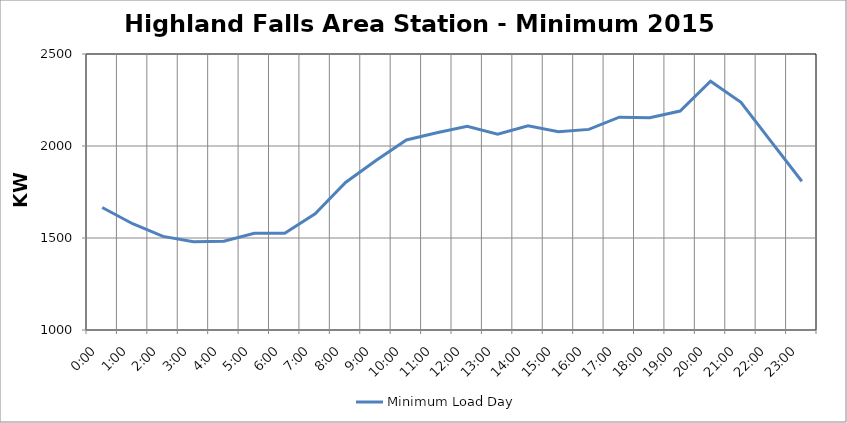
| Category | Minimum Load Day |
|---|---|
| 0.0 | 1665.585 |
| 0.041666666666666664 | 1577.508 |
| 0.08333333333333333 | 1508.923 |
| 0.125 | 1479.854 |
| 0.16666666666666666 | 1481.999 |
| 0.20833333333333334 | 1525.292 |
| 0.25 | 1526.347 |
| 0.2916666666666667 | 1631.322 |
| 0.3333333333333333 | 1801.879 |
| 0.375 | 1921.045 |
| 0.4166666666666667 | 2032.881 |
| 0.4583333333333333 | 2071.716 |
| 0.5 | 2106.872 |
| 0.5416666666666666 | 2064.701 |
| 0.5833333333333334 | 2109.912 |
| 0.625 | 2077.414 |
| 0.6666666666666666 | 2090.299 |
| 0.7083333333333334 | 2156.429 |
| 0.75 | 2153.29 |
| 0.7916666666666666 | 2190.189 |
| 0.8333333333333334 | 2352.041 |
| 0.875 | 2237.053 |
| 0.9166666666666666 | 2022.496 |
| 0.9583333333333334 | 1808.231 |